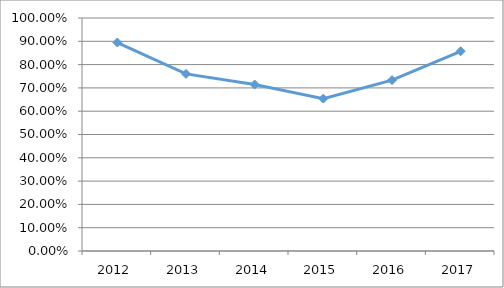
| Category | INTE-C5O44 |
|---|---|
| 2012.0 | 0.895 |
| 2013.0 | 0.76 |
| 2014.0 | 0.714 |
| 2015.0 | 0.654 |
| 2016.0 | 0.733 |
| 2017.0 | 0.857 |